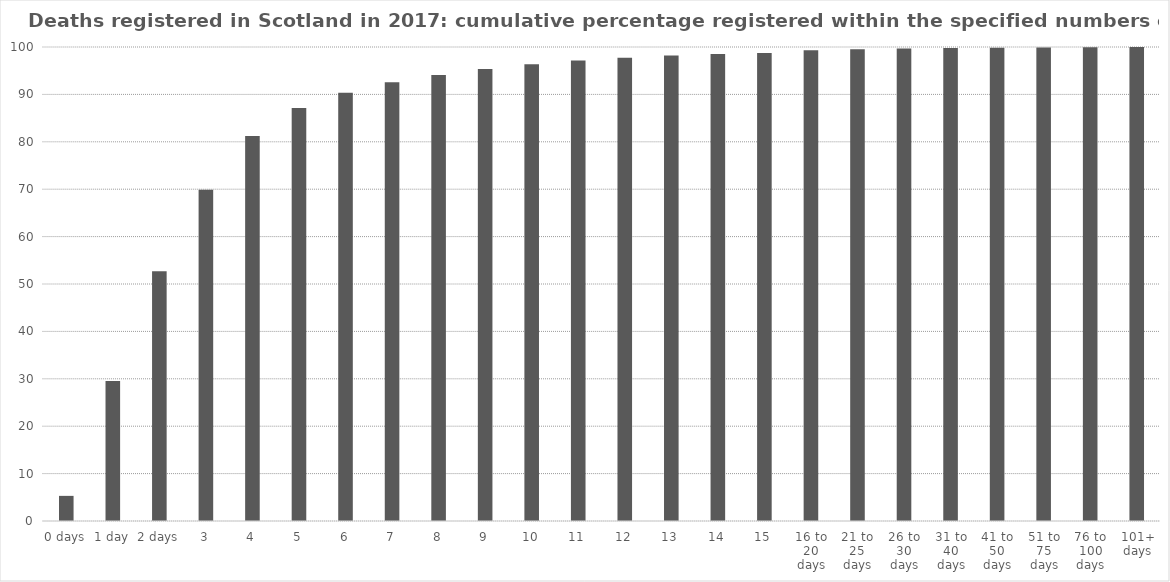
| Category | Cumulative percentage |
|---|---|
| 0 days | 5.3 |
| 1 day | 29.53 |
| 2 days | 52.71 |
| 3 | 69.9 |
| 4 | 81.23 |
| 5 | 87.11 |
| 6 | 90.36 |
| 7 | 92.54 |
| 8 | 94.11 |
| 9 | 95.36 |
| 10 | 96.36 |
| 11 | 97.14 |
| 12 | 97.75 |
| 13 | 98.23 |
| 14 | 98.53 |
| 15 | 98.73 |
| 16 to 20 days | 99.31 |
| 21 to 25 days | 99.55 |
| 26 to 30 days | 99.68 |
| 31 to 40 days | 99.8 |
| 41 to 50 days | 99.85 |
| 51 to 75 days | 99.92 |
| 76 to 100 days | 99.96 |
| 101+ days | 100 |